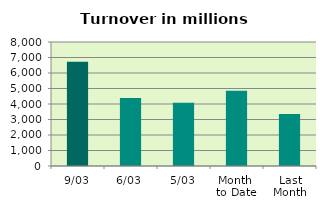
| Category | Series 0 |
|---|---|
| 9/03 | 6723.168 |
| 6/03 | 4391.939 |
| 5/03 | 4075.088 |
| Month 
to Date | 4856.435 |
| Last
Month | 3347.876 |